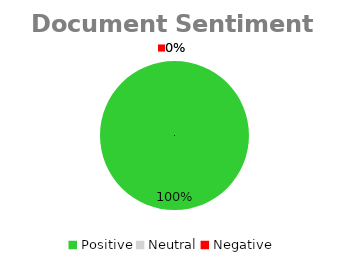
| Category | Document Sentiment Total |
|---|---|
| Positive | 19 |
| Neutral | 0 |
| Negative | 0 |